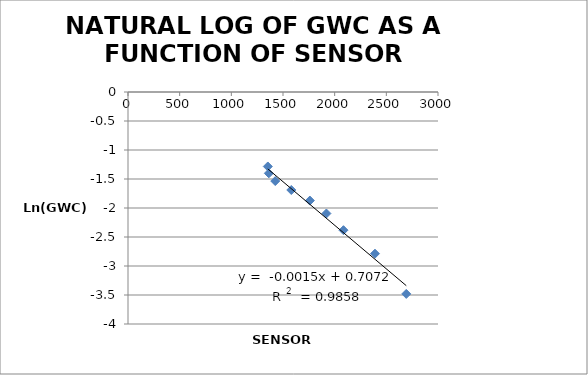
| Category | Series 0 |
|---|---|
| 2693.0 | -3.481 |
| 2390.0 | -2.788 |
| 2085.0 | -2.383 |
| 1920.0 | -2.095 |
| 1760.0 | -1.872 |
| 1580.0 | -1.689 |
| 1425.0 | -1.535 |
| 1363.0 | -1.402 |
| 1353.0 | -1.284 |